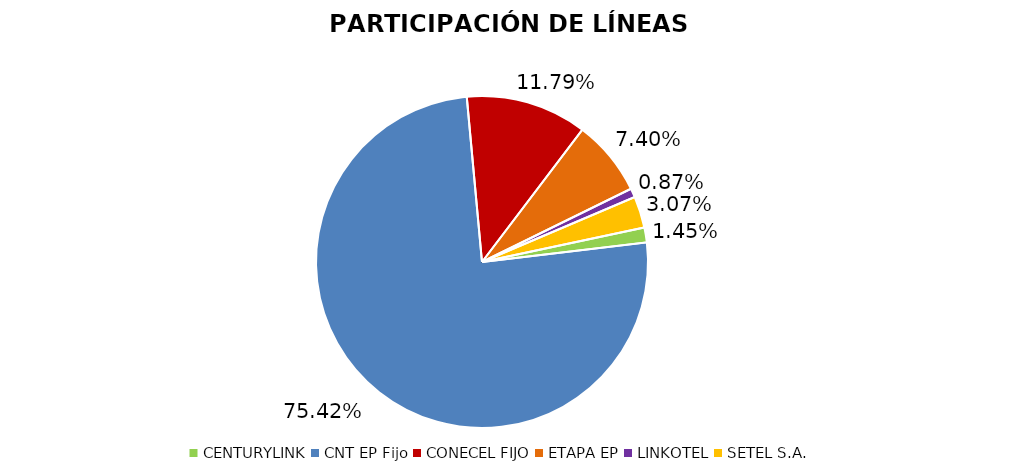
| Category | Participación en el Mercado |
|---|---|
| CENTURYLINK | 0.014 |
| CNT EP Fijo | 0.754 |
| CONECEL FIJO | 0.118 |
| ETAPA EP | 0.074 |
| LINKOTEL | 0.009 |
| SETEL S.A. | 0.031 |